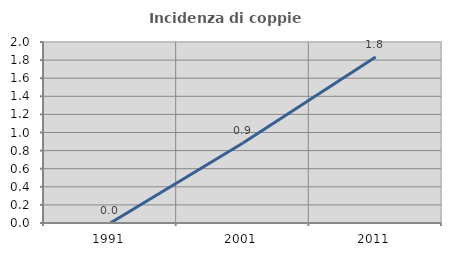
| Category | Incidenza di coppie miste |
|---|---|
| 1991.0 | 0 |
| 2001.0 | 0.885 |
| 2011.0 | 1.835 |